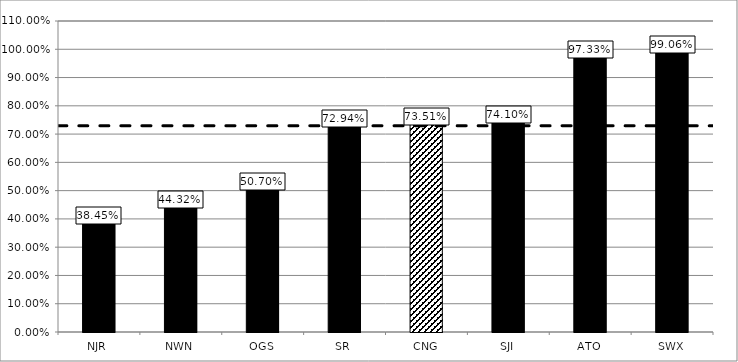
| Category | 2019-2023 |
|---|---|
| NJR | 0.384 |
| NWN | 0.443 |
| OGS | 0.507 |
| SR | 0.729 |
| CNG | 0.735 |
| SJI | 0.741 |
| ATO | 0.973 |
| SWX | 0.991 |